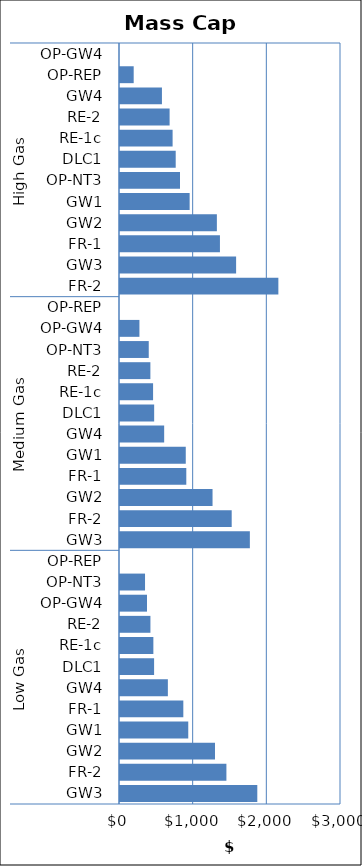
| Category | Mass Cap B |
|---|---|
| 0 | 1863.794 |
| 1 | 1444.429 |
| 2 | 1289.544 |
| 3 | 926.605 |
| 4 | 859.603 |
| 5 | 649.802 |
| 6 | 462.818 |
| 7 | 452.87 |
| 8 | 413.019 |
| 9 | 366.745 |
| 10 | 339.81 |
| 11 | 0 |
| 12 | 1762.804 |
| 13 | 1516.241 |
| 14 | 1256.198 |
| 15 | 899.958 |
| 16 | 892.79 |
| 17 | 599.613 |
| 18 | 463.814 |
| 19 | 449.028 |
| 20 | 412.405 |
| 21 | 390.241 |
| 22 | 263.71 |
| 23 | 0 |
| 24 | 2149.764 |
| 25 | 1576.168 |
| 26 | 1356.647 |
| 27 | 1315.07 |
| 28 | 945.341 |
| 29 | 814.519 |
| 30 | 756.227 |
| 31 | 714.081 |
| 32 | 673.385 |
| 33 | 569.315 |
| 34 | 185.811 |
| 35 | 0 |